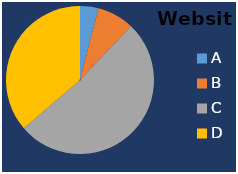
| Category | Website |
|---|---|
| A | 50 |
| B | 100 |
| C | 640 |
| D | 450 |